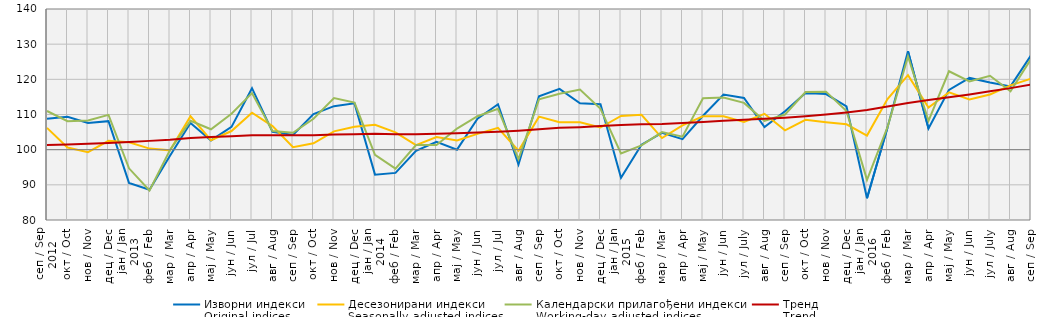
| Category | Изворни индекси
Original indices | Десезонирани индекси
Seasonally adjusted indices | Календарски прилагођени индекси
Working-day adjusted indices | Тренд
Trend |
|---|---|---|---|---|
| 0 | 108.809 | 106.2 | 111 | 101.3 |
| 1 | 109.371 | 100.6 | 108.1 | 101.5 |
| 2 | 107.609 | 99.3 | 108.3 | 101.7 |
| 3 | 108.112 | 102.5 | 109.9 | 101.9 |
| 4 | 90.559 | 102.1 | 94.7 | 102.2 |
| 5 | 88.596 | 100.3 | 88.4 | 102.5 |
| 6 | 98.288 | 99.8 | 99.9 | 102.8 |
| 7 | 107.567 | 109.5 | 108.2 | 103.3 |
| 8 | 102.635 | 102.7 | 105.8 | 103.6 |
| 9 | 106.478 | 105.3 | 110.2 | 103.8 |
| 10 | 117.488 | 110.5 | 116.1 | 104.1 |
| 11 | 105.073 | 106.7 | 105.3 | 104.1 |
| 12 | 104.198 | 100.7 | 104.8 | 104.1 |
| 13 | 110.096 | 101.8 | 108.8 | 104.1 |
| 14 | 112.368 | 105.2 | 114.7 | 104.3 |
| 15 | 113.169 | 106.5 | 113.4 | 104.4 |
| 16 | 92.9 | 107.1 | 98.5 | 104.5 |
| 17 | 93.4 | 104.9 | 94.6 | 104.4 |
| 18 | 99.7 | 101.3 | 101.3 | 104.4 |
| 19 | 102.2 | 103.6 | 101.3 | 104.5 |
| 20 | 100 | 102.6 | 106 | 104.7 |
| 21 | 108.8 | 104.5 | 109.5 | 104.9 |
| 22 | 112.9 | 106.2 | 111.6 | 105.1 |
| 23 | 95.8 | 99.7 | 97.3 | 105.4 |
| 24 | 115.2 | 109.4 | 114.3 | 105.8 |
| 25 | 117.3 | 107.8 | 115.9 | 106.2 |
| 26 | 113.2 | 107.8 | 117.1 | 106.4 |
| 27 | 112.9 | 106.3 | 111.6 | 106.7 |
| 28 | 92 | 109.6 | 98.9 | 107 |
| 29 | 101.4 | 109.9 | 101.2 | 107.2 |
| 30 | 104.8 | 103.3 | 105 | 107.3 |
| 31 | 103 | 106.9 | 103.7 | 107.6 |
| 32 | 109.651 | 109.5 | 114.6 | 107.9 |
| 33 | 115.698 | 109.5 | 114.8 | 108.2 |
| 34 | 114.7 | 107.9 | 113.3 | 108.5 |
| 35 | 106.4 | 110.2 | 108.2 | 108.8 |
| 36 | 110.9 | 105.5 | 110 | 109.1 |
| 37 | 116.1 | 108.5 | 116.4 | 109.5 |
| 38 | 115.8 | 107.8 | 116.5 | 110 |
| 39 | 112.3 | 107.2 | 111 | 110.6 |
| 40 | 86.2 | 104 | 91.4 | 111.3 |
| 41 | 106.3 | 114.4 | 106.4 | 112.3 |
| 42 | 128 | 121.2 | 126.5 | 113.3 |
| 43 | 106 | 112 | 108.2 | 114.1 |
| 44 | 117 | 116.3 | 122.3 | 114.9 |
| 45 | 120.4 | 114.3 | 119.4 | 115.7 |
| 46 | 119.1 | 115.7 | 121 | 116.6 |
| 47 | 118 | 118.3 | 116.6 | 117.5 |
| 48 | 126.8 | 120.2 | 125.8 | 118.5 |